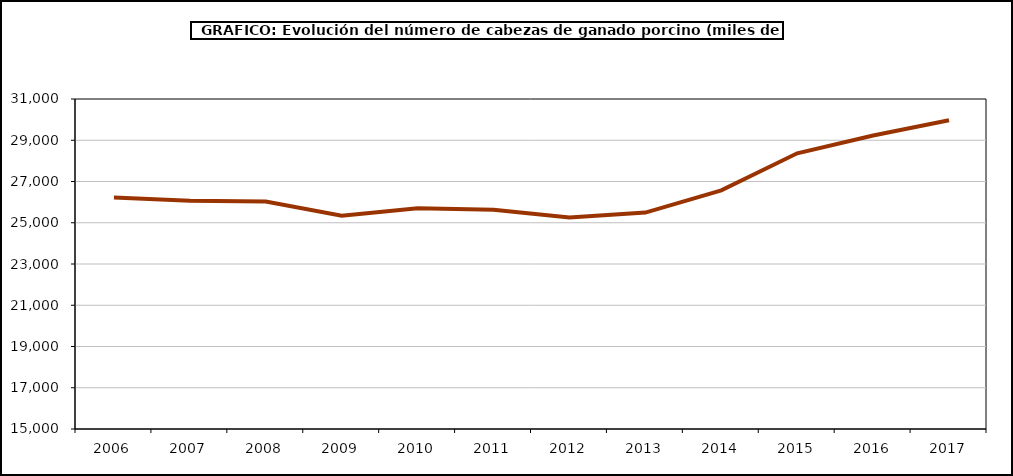
| Category | Total porcino |
|---|---|
| 2006.0 | 26218.706 |
| 2007.0 | 26061.232 |
| 2008.0 | 26025.672 |
| 2009.0 | 25342.606 |
| 2010.0 | 25704 |
| 2011.0 | 25634 |
| 2012.0 | 25250.377 |
| 2013.0 | 25494.715 |
| 2014.0 | 26567.578 |
| 2015.0 | 28367.335 |
| 2016.0 | 29231.595 |
| 2017.0 | 29971.357 |